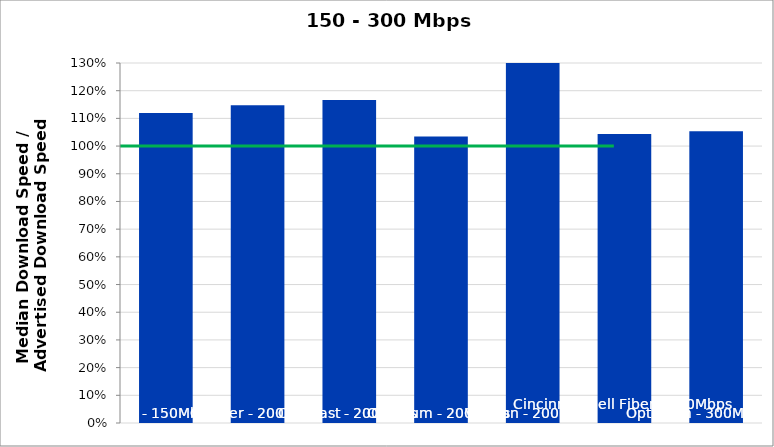
| Category | Series 0 |
|---|---|
| Cox - 150Mbps | 1.119 |
| Charter - 200Mbps | 1.147 |
| Comcast - 200Mbps | 1.166 |
| Optimum - 200Mbps | 1.035 |
| Verizon - 200Mbps | 1.471 |
| Cincinnati Bell Fiber - 250Mbps | 1.044 |
| Optimum - 300Mbps | 1.054 |